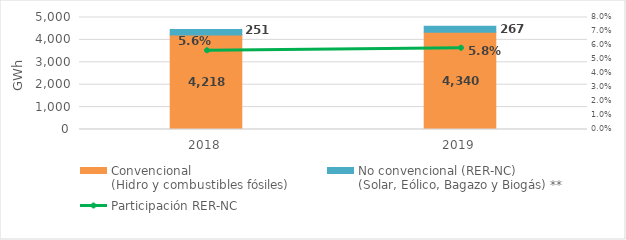
| Category | Convencional
(Hidro y combustibles fósiles) | No convencional (RER-NC)
(Solar, Eólico, Bagazo y Biogás) ** |
|---|---|---|
| 2018.0 | 4217.883 | 251.426 |
| 2019.0 | 4340.19 | 267.416 |